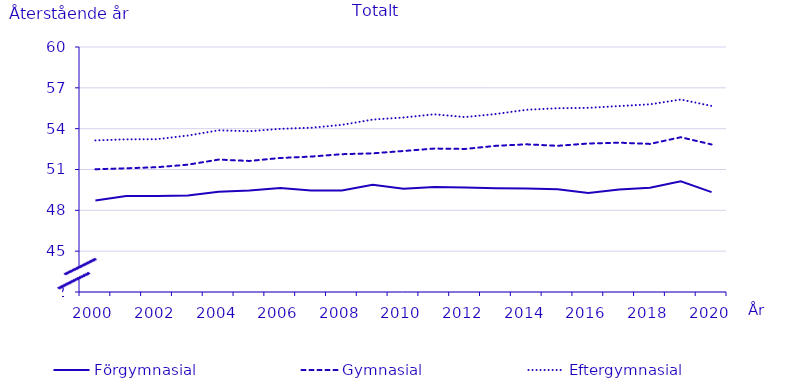
| Category | Förgymnasial | Gymnasial | Eftergymnasial |
|---|---|---|---|
| 2000.0 | 48.731 | 51.02 | 53.137 |
| 2001.0 | 49.05 | 51.09 | 53.215 |
| 2002.0 | 49.047 | 51.169 | 53.227 |
| 2003.0 | 49.095 | 51.354 | 53.494 |
| 2004.0 | 49.374 | 51.728 | 53.879 |
| 2005.0 | 49.45 | 51.628 | 53.812 |
| 2006.0 | 49.641 | 51.846 | 53.988 |
| 2007.0 | 49.465 | 51.948 | 54.069 |
| 2008.0 | 49.458 | 52.125 | 54.278 |
| 2009.0 | 49.886 | 52.189 | 54.669 |
| 2010.0 | 49.592 | 52.36 | 54.819 |
| 2011.0 | 49.723 | 52.538 | 55.057 |
| 2012.0 | 49.68 | 52.51 | 54.85 |
| 2013.0 | 49.63 | 52.74 | 55.08 |
| 2014.0 | 49.61 | 52.85 | 55.39 |
| 2015.0 | 49.54 | 52.74 | 55.5 |
| 2016.0 | 49.27 | 52.91 | 55.53 |
| 2017.0 | 49.53 | 52.97 | 55.66 |
| 2018.0 | 49.66 | 52.88 | 55.79 |
| 2019.0 | 50.14 | 53.37 | 56.14 |
| 2020.0 | 49.34 | 52.84 | 55.67 |